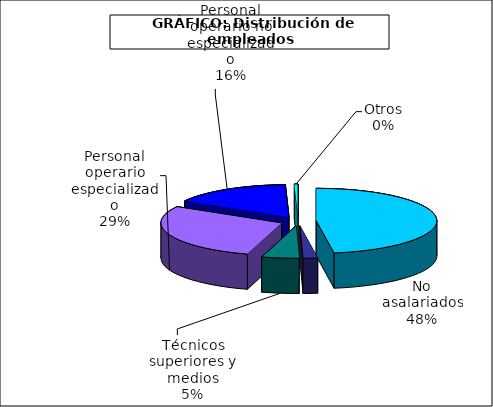
| Category | Series 0 |
|---|---|
| No asalariados | 7209.4 |
| Administrativos | 293.71 |
| Técnicos superiores y medios | 757.31 |
| Personal operario especializado | 4350.408 |
| Personal operario no especializado | 2448.95 |
| Otros | 73.78 |